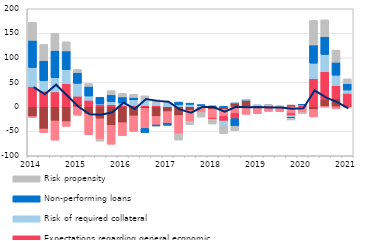
| Category | Costs of funding | Competition from other banks | Expectations regarding general economic situation | Risk of required collateral  | Non-performing loans  | Risk propensity |
|---|---|---|---|---|---|---|
| 2014.0 | -19.9 | -1.7 | 41 | 39.1 | 55.5 | 36.9 |
| nan | -45.3 | -7.7 | 31.9 | 21.4 | 40.8 | 33.2 |
| nan | -29 | -39.1 | 30.4 | 28.9 | 55.7 | 34.4 |
| nan | -30.3 | -9.6 | 47.3 | 28.6 | 38.1 | 18.7 |
| 2015.0 | 5.3 | -17.2 | 16.4 | 26.1 | 22.1 | 6.2 |
| nan | -14.5 | -42.3 | 13.3 | 8.7 | 19.6 | 6 |
| nan | -24.7 | -41.2 | 5.2 | 0.6 | 13.5 | -4.1 |
| nan | -38.1 | -38.3 | 4.2 | 6.5 | 13.7 | 8.7 |
| 2016.0 | -32.5 | -26.6 | 2.8 | 4.8 | 12.6 | 7.3 |
| nan | -18.6 | -31.7 | 2.8 | 11.4 | 4.8 | 6.6 |
| nan | -3.2 | -40.9 | 2.6 | 11.7 | -8.5 | 8 |
| nan | -19.7 | -17.5 | 2.6 | 6.4 | -2 | 5.6 |
| 2017.0 | -9.9 | -23.6 | 0.3 | 6.6 | -4.3 | 1.9 |
| nan | -17.9 | -37.2 | 0.4 | 3.4 | 5.9 | -12.7 |
| nan | -7.4 | -22.4 | 0.6 | 4.3 | 2.5 | -6.8 |
| nan | -2.2 | -9.3 | 0.1 | 2.2 | 2.2 | -9.5 |
| 2018.0 | -5.5 | -17.5 | -2.5 | 0 | 1.9 | -9.6 |
| nan | -5.2 | -14.4 | -9.5 | -9.1 | 0.3 | -16.5 |
| nan | 8.2 | -13.3 | -10.8 | 0.3 | -15.6 | -8.9 |
| nan | 13.5 | -15.5 | 0.1 | 0.3 | 0.3 | 0.1 |
| 2019.0 | 0 | -14 | 0.1 | 2.4 | 0.3 | 0.1 |
| nan | 2.3 | -9.4 | 0.1 | 0.3 | 0.3 | 0.1 |
| nan | 0 | -9.9 | 0.1 | 0.4 | 0.4 | 0.1 |
| nan | 3.5 | -13.7 | -4.4 | -3.2 | -2.2 | -3.4 |
| 2020.0 | 0 | -11.9 | 3.7 | 0.4 | 0.4 | -2.6 |
| nan | -5.6 | -15.1 | 57.7 | 31.2 | 37.3 | 50 |
| nan | 15.9 | -0.1 | 55.9 | 35 | 36.1 | 34.5 |
| nan | 16.2 | -4 | 27.2 | 21.1 | 26.4 | 24.9 |
| 2021.0 | 0 | -0.2 | 27.5 | 6.7 | 12.9 | 10 |